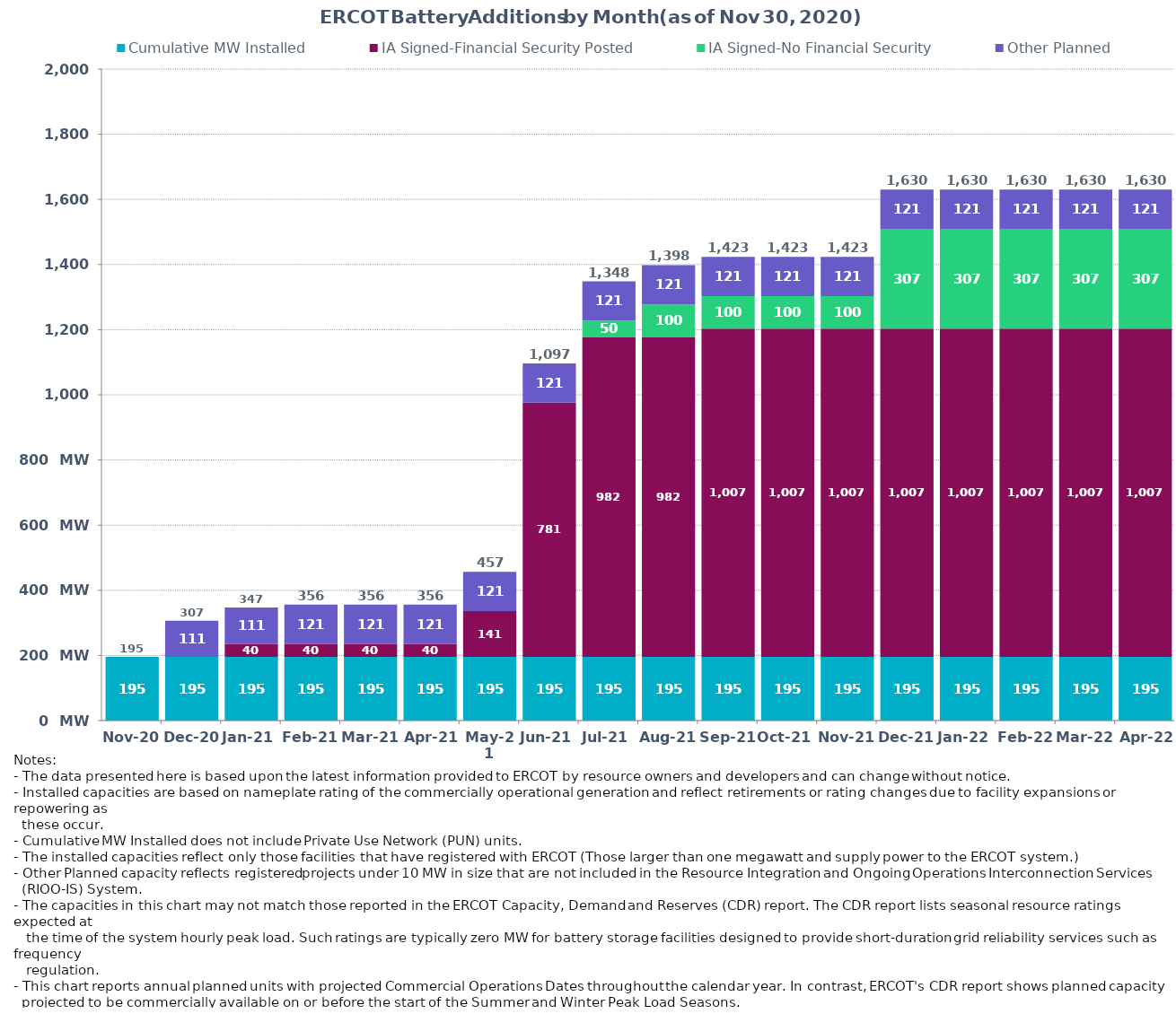
| Category | Cumulative MW Installed | Cumulative MW Synchronized | IA Signed-Financial Security Posted  | IA Signed-No Financial Security  | Other Planned | Cumulative Installed and Planned |
|---|---|---|---|---|---|---|
| 2020-11-20 | 195.4 | 0 | 0 | 0 | 0 | 195.4 |
| 2020-12-20 | 195.4 | 0 | 0 | 0 | 111.4 | 306.8 |
| 2021-01-20 | 195.4 | 0 | 40.26 | 0 | 111.4 | 347.06 |
| 2021-02-20 | 195.4 | 0 | 40.26 | 0 | 120.58 | 356.24 |
| 2021-03-20 | 195.4 | 0 | 40.26 | 0 | 120.58 | 356.24 |
| 2021-04-20 | 195.4 | 0 | 40.26 | 0 | 120.58 | 356.24 |
| 2021-05-20 | 195.4 | 0 | 140.75 | 0 | 120.58 | 456.73 |
| 2021-06-20 | 195.4 | 0 | 780.64 | 0 | 120.58 | 1096.62 |
| 2021-07-20 | 195.4 | 0 | 982.34 | 50 | 120.58 | 1348.32 |
| 2021-08-20 | 195.4 | 0 | 982.34 | 100 | 120.58 | 1398.32 |
| 2021-09-20 | 195.4 | 0 | 1007.46 | 100 | 120.58 | 1423.44 |
| 2021-10-20 | 195.4 | 0 | 1007.46 | 100 | 120.58 | 1423.44 |
| 2021-11-20 | 195.4 | 0 | 1007.46 | 100 | 120.58 | 1423.44 |
| 2021-12-20 | 195.4 | 0 | 1007.46 | 306.97 | 120.58 | 1630.41 |
| 2022-01-20 | 195.4 | 0 | 1007.46 | 306.97 | 120.58 | 1630.41 |
| 2022-02-20 | 195.4 | 0 | 1007.46 | 306.97 | 120.58 | 1630.41 |
| 2022-03-20 | 195.4 | 0 | 1007.46 | 306.97 | 120.58 | 1630.41 |
| 2022-04-20 | 195.4 | 0 | 1007.46 | 306.97 | 120.58 | 1630.41 |